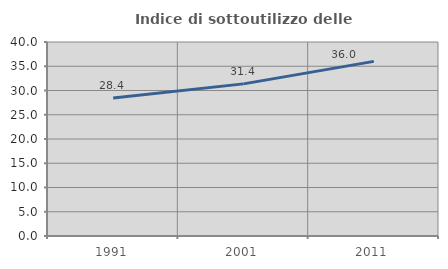
| Category | Indice di sottoutilizzo delle abitazioni  |
|---|---|
| 1991.0 | 28.449 |
| 2001.0 | 31.364 |
| 2011.0 | 36.005 |